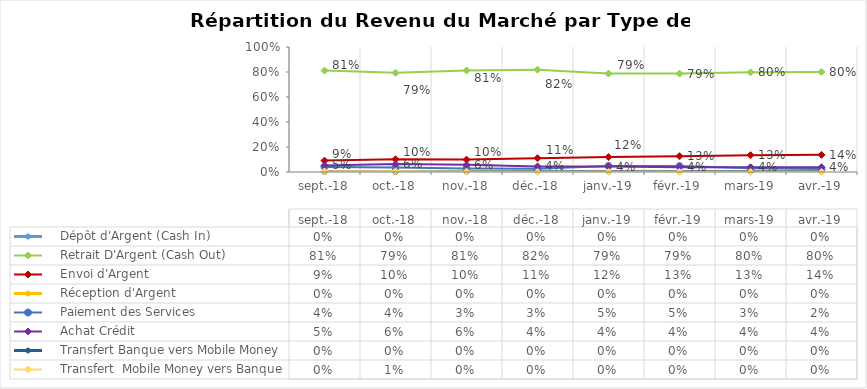
| Category |     Dépôt d'Argent (Cash In) |     Retrait D'Argent (Cash Out)  |     Envoi d'Argent  |     Réception d'Argent |     Paiement des Services |     Achat Crédit |     Transfert Banque vers Mobile Money |     Transfert  Mobile Money vers Banque  |
|---|---|---|---|---|---|---|---|---|
| 2018-09-01 | 0 | 0.811 | 0.091 | 0 | 0.04 | 0.052 | 0 | 0.005 |
| 2018-10-01 | 0 | 0.794 | 0.102 | 0 | 0.035 | 0.064 | 0 | 0.005 |
| 2018-11-01 | 0 | 0.812 | 0.099 | 0 | 0.029 | 0.057 | 0 | 0.002 |
| 2018-12-01 | 0 | 0.819 | 0.11 | 0 | 0.025 | 0.045 | 0 | 0.001 |
| 2019-01-01 | 0 | 0.788 | 0.119 | 0 | 0.048 | 0.044 | 0 | 0.001 |
| 2019-02-01 | 0 | 0.788 | 0.126 | 0 | 0.047 | 0.039 | 0 | 0 |
| 2019-03-01 | 0 | 0.797 | 0.134 | 0 | 0.03 | 0.038 | 0 | 0 |
| 2019-04-01 | 0 | 0.8 | 0.137 | 0 | 0.024 | 0.038 | 0 | 0 |